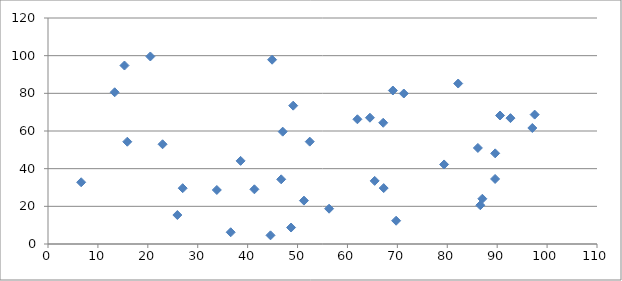
| Category | Β |
|---|---|
| 46.724848609529104 | 34.345 |
| 86.6152080422417 | 20.582 |
| 97.04187448175526 | 61.601 |
| 67.16603984913104 | 64.368 |
| 44.58372135262556 | 4.601 |
| 64.50718136436126 | 67.06 |
| 79.36376879857497 | 42.243 |
| 36.60996774446279 | 6.239 |
| 25.920816353913878 | 15.385 |
| 13.362300056777787 | 80.561 |
| 69.10133088794584 | 81.498 |
| 86.13324769364763 | 51.005 |
| 56.32047301618564 | 18.742 |
| 20.505042965474995 | 99.574 |
| 41.35616838626872 | 29.039 |
| 44.89848999238815 | 97.852 |
| 26.987852341390585 | 29.634 |
| 6.648122205725748 | 32.771 |
| 61.99699744711755 | 66.224 |
| 47.026339851207325 | 59.649 |
| 92.66405656669244 | 66.829 |
| 89.59859014782663 | 48.132 |
| 51.28379552033402 | 23.035 |
| 89.5801742004183 | 34.537 |
| 87.02532673961404 | 24.023 |
| 67.25760944848795 | 29.688 |
| 97.51112675614175 | 68.709 |
| 15.887794965917656 | 54.308 |
| 33.82446080187549 | 28.688 |
| 69.75389290992541 | 12.359 |
| 38.59206754363021 | 44.143 |
| 49.128016641445285 | 73.452 |
| 22.954254228766313 | 52.957 |
| 52.4456073822475 | 54.346 |
| 65.45143081126241 | 33.511 |
| 48.70258203189937 | 8.753 |
| 15.321857717631282 | 94.767 |
| 90.57112591904651 | 68.224 |
| 82.18918499169644 | 85.211 |
| 71.29014351135585 | 79.91 |